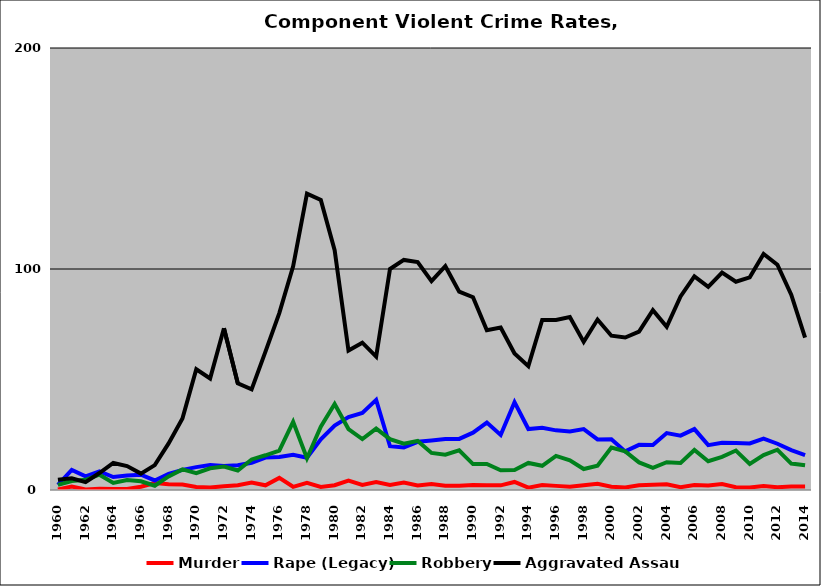
| Category | Murder | Rape (Legacy) | Robbery | Aggravated Assault |
|---|---|---|---|---|
| 1960.0 | 0.256 | 2.308 | 2.308 | 4.617 |
| 1961.0 | 1.519 | 9.114 | 4.051 | 5.316 |
| 1962.0 | 0.256 | 6.154 | 4.615 | 3.59 |
| 1963.0 | 0.513 | 8.462 | 6.923 | 7.692 |
| 1964.0 | 0.489 | 5.868 | 3.178 | 12.225 |
| 1965.0 | 0.504 | 6.549 | 4.534 | 10.831 |
| 1966.0 | 1.481 | 6.914 | 3.951 | 7.407 |
| 1967.0 | 3.118 | 4.317 | 1.918 | 11.271 |
| 1968.0 | 2.607 | 7.346 | 6.161 | 21.09 |
| 1969.0 | 2.506 | 9.112 | 9.339 | 32.346 |
| 1970.0 | 1.349 | 10.343 | 7.645 | 54.64 |
| 1971.0 | 1.092 | 11.354 | 9.825 | 50.437 |
| 1972.0 | 1.732 | 10.823 | 10.606 | 73.16 |
| 1973.0 | 2.155 | 11.207 | 8.836 | 48.276 |
| 1974.0 | 3.404 | 12.34 | 13.83 | 45.532 |
| 1975.0 | 2.123 | 14.65 | 15.711 | 62.633 |
| 1976.0 | 5.462 | 14.916 | 17.857 | 80.042 |
| 1977.0 | 1.449 | 15.942 | 30.849 | 101.242 |
| 1978.0 | 3.285 | 14.579 | 14.374 | 134.086 |
| 1979.0 | 1.42 | 22.921 | 28.6 | 131.237 |
| 1980.0 | 2.151 | 29.141 | 38.92 | 108.547 |
| 1981.0 | 4.272 | 33.01 | 27.573 | 63.107 |
| 1982.0 | 2.326 | 34.884 | 23.062 | 66.667 |
| 1983.0 | 3.619 | 40.762 | 27.81 | 60.381 |
| 1984.0 | 2.264 | 19.811 | 23.019 | 100 |
| 1985.0 | 3.364 | 19.252 | 20.935 | 104.112 |
| 1986.0 | 2.033 | 21.811 | 22.181 | 103.142 |
| 1987.0 | 2.737 | 22.445 | 16.788 | 94.526 |
| 1988.0 | 1.978 | 23.022 | 16.007 | 101.259 |
| 1989.0 | 1.94 | 23.104 | 17.989 | 89.771 |
| 1990.0 | 2.31 | 25.944 | 11.728 | 87.249 |
| 1991.0 | 2.116 | 30.511 | 11.817 | 72.31 |
| 1992.0 | 2.105 | 24.912 | 8.947 | 73.509 |
| 1993.0 | 3.646 | 39.757 | 9.028 | 61.806 |
| 1994.0 | 1.034 | 27.586 | 12.241 | 56.034 |
| 1995.0 | 2.222 | 28.205 | 10.94 | 76.923 |
| 1996.0 | 1.868 | 26.995 | 15.45 | 76.91 |
| 1997.0 | 1.528 | 26.486 | 13.413 | 78.268 |
| 1998.0 | 2.2 | 27.58 | 9.475 | 67.005 |
| 1999.0 | 2.863 | 22.906 | 10.948 | 77.138 |
| 2000.0 | 1.478 | 22.995 | 19.217 | 69.806 |
| 2001.0 | 1.142 | 17.456 | 17.456 | 69.007 |
| 2002.0 | 2.109 | 20.441 | 12.492 | 71.706 |
| 2003.0 | 2.422 | 20.344 | 10.011 | 81.377 |
| 2004.0 | 2.576 | 25.755 | 12.556 | 73.885 |
| 2005.0 | 1.285 | 24.583 | 12.211 | 87.566 |
| 2006.0 | 2.244 | 27.568 | 18.112 | 96.649 |
| 2007.0 | 2.093 | 20.282 | 13.038 | 91.911 |
| 2008.0 | 2.737 | 21.415 | 14.975 | 98.382 |
| 2009.0 | 1.287 | 21.23 | 17.853 | 94.249 |
| 2010.0 | 1.119 | 21.095 | 11.826 | 96.206 |
| 2011.0 | 1.756 | 23.301 | 15.8 | 106.768 |
| 2012.0 | 1.278 | 20.928 | 18.212 | 101.925 |
| 2013.0 | 1.595 | 18.026 | 11.964 | 88.378 |
| 2014.0 | 1.596 | 15.801 | 11.172 | 68.948 |